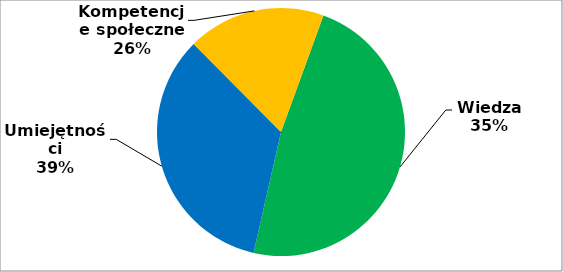
| Category | Series 0 |
|---|---|
| 0 | 24 |
| 1 | 17 |
| 2 | 9 |